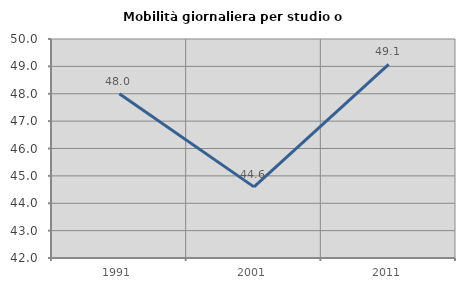
| Category | Mobilità giornaliera per studio o lavoro |
|---|---|
| 1991.0 | 48 |
| 2001.0 | 44.598 |
| 2011.0 | 49.075 |